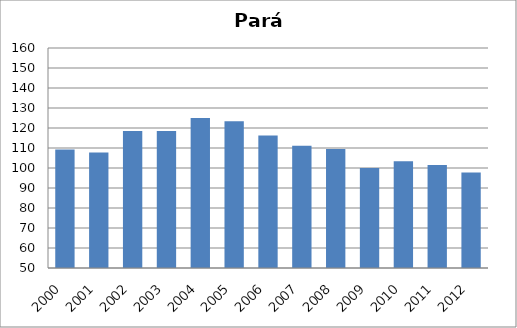
| Category | Poliomielite |
|---|---|
| 2000.0 | 109.25 |
| 2001.0 | 107.74 |
| 2002.0 | 118.45 |
| 2003.0 | 118.52 |
| 2004.0 | 124.94 |
| 2005.0 | 123.42 |
| 2006.0 | 116.22 |
| 2007.0 | 111.15 |
| 2008.0 | 109.56 |
| 2009.0 | 99.97 |
| 2010.0 | 103.38 |
| 2011.0 | 101.54 |
| 2012.0 | 97.78 |